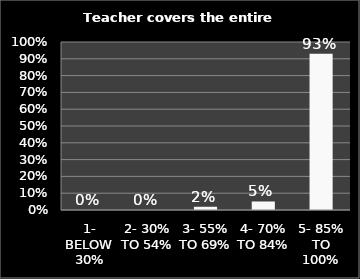
| Category | Series 0 |
|---|---|
| 1- BELOW 30% | 0 |
| 2- 30% TO 54% | 0 |
| 3- 55% TO 69% | 0.019 |
| 4- 70% TO 84% | 0.051 |
| 5- 85% TO 100% | 0.93 |